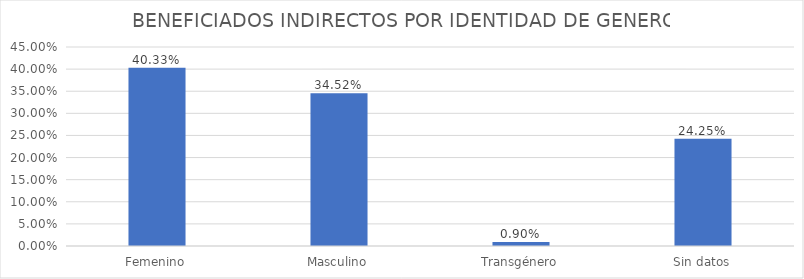
| Category | % |
|---|---|
| Femenino | 0.403 |
| Masculino | 0.345 |
| Transgénero | 0.009 |
| Sin datos | 0.243 |